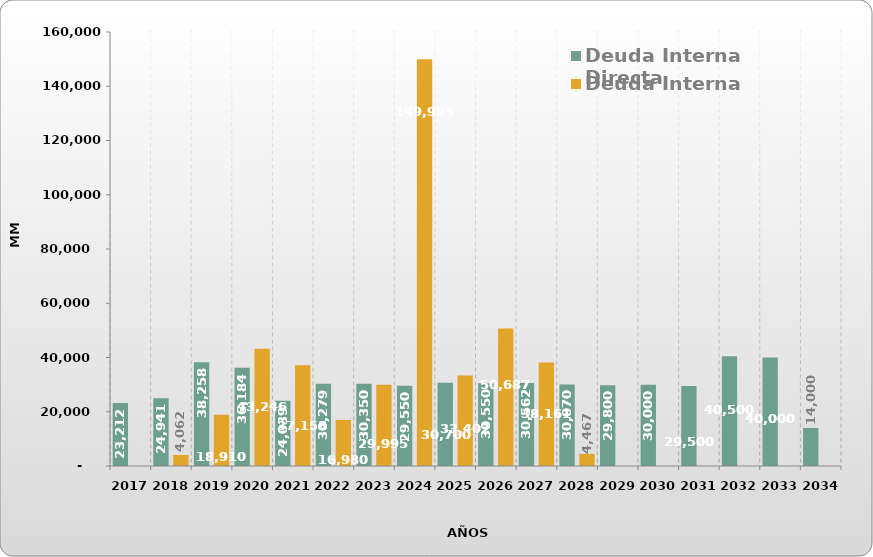
| Category | Deuda Interna Directa | Deuda Interna Indirecta |
|---|---|---|
| 2017.0 | 23212.48 | 0 |
| 2018.0 | 24941.231 | 4062.481 |
| 2019.0 | 38257.991 | 18909.974 |
| 2020.0 | 36184.293 | 43246.154 |
| 2021.0 | 24038.607 | 37158.29 |
| 2022.0 | 30278.959 | 16979.963 |
| 2023.0 | 30350 | 29995.256 |
| 2024.0 | 29550 | 149995.256 |
| 2025.0 | 30700 | 33401.892 |
| 2026.0 | 30550 | 50686.549 |
| 2027.0 | 30561.643 | 38160.84 |
| 2028.0 | 30070.329 | 4467.091 |
| 2029.0 | 29800 | 0 |
| 2030.0 | 30000 | 0 |
| 2031.0 | 29500 | 0 |
| 2032.0 | 40500 | 0 |
| 2033.0 | 40000 | 0 |
| 2034.0 | 14000 | 0 |